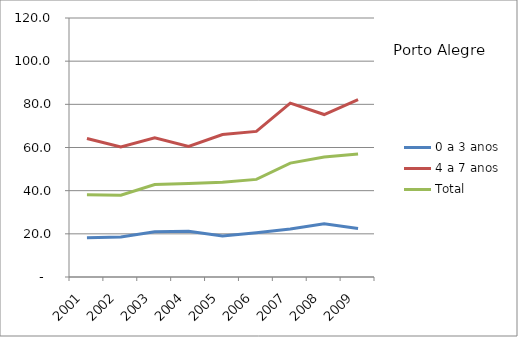
| Category | 0 a 3 anos | 4 a 7 anos | Total |
|---|---|---|---|
| 2001.0 | 18.17 | 64.18 | 38.07 |
| 2002.0 | 18.52 | 60.27 | 37.87 |
| 2003.0 | 20.99 | 64.5 | 42.85 |
| 2004.0 | 21.21 | 60.52 | 43.35 |
| 2005.0 | 19.05 | 66.03 | 43.85 |
| 2006.0 | 20.49 | 67.45 | 45.22 |
| 2007.0 | 22.21 | 80.57 | 52.77 |
| 2008.0 | 24.64 | 75.28 | 55.56 |
| 2009.0 | 22.45 | 82.18 | 56.97 |